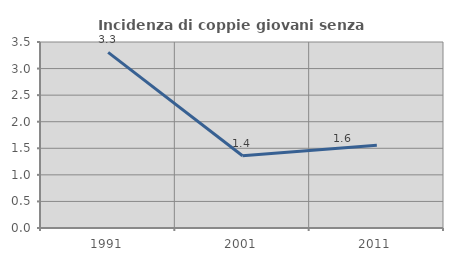
| Category | Incidenza di coppie giovani senza figli |
|---|---|
| 1991.0 | 3.306 |
| 2001.0 | 1.359 |
| 2011.0 | 1.558 |